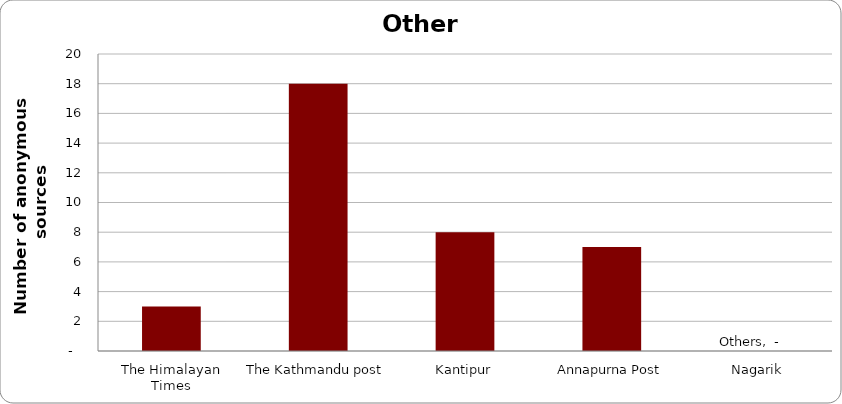
| Category | Others |
|---|---|
| The Himalayan Times | 3 |
| The Kathmandu post | 18 |
| Kantipur | 8 |
| Annapurna Post | 7 |
| Nagarik | 0 |